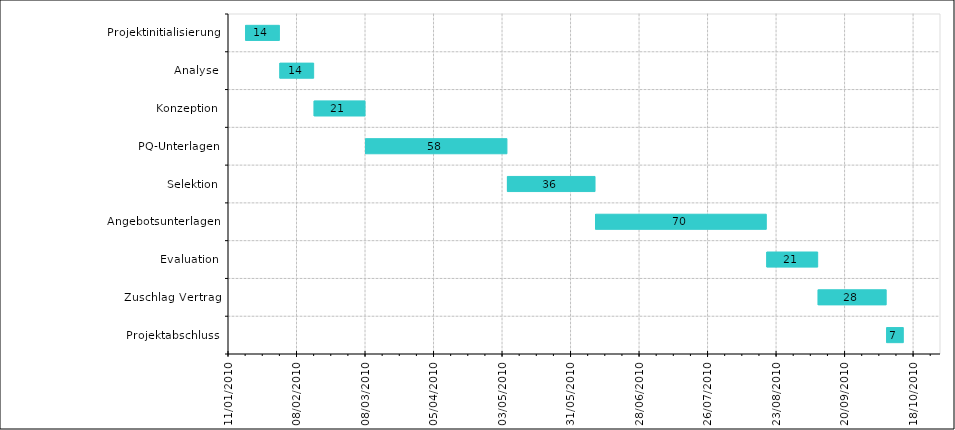
| Category | Beginn | Laufzeit |
|---|---|---|
| Projektinitialisierung | 18/01/2010 | 14 |
| Analyse | 01/02/2010 | 14 |
| Konzeption | 15/02/2010 | 21 |
| PQ-Unterlagen | 08/03/2010 | 58 |
| Selektion | 05/05/2010 | 36 |
| Angebotsunterlagen | 10/06/2010 | 70 |
| Evaluation | 19/08/2010 | 21 |
| Zuschlag Vertrag | 09/09/2010 | 28 |
| Projektabschluss | 07/10/2010 | 7 |